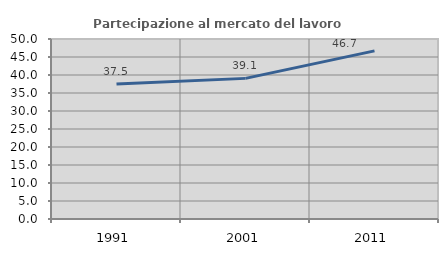
| Category | Partecipazione al mercato del lavoro  femminile |
|---|---|
| 1991.0 | 37.47 |
| 2001.0 | 39.062 |
| 2011.0 | 46.705 |